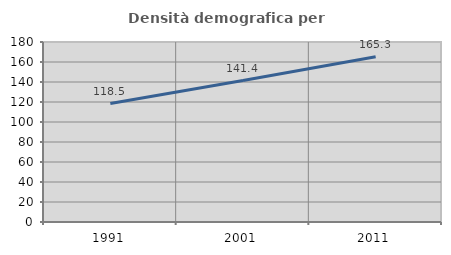
| Category | Densità demografica |
|---|---|
| 1991.0 | 118.462 |
| 2001.0 | 141.449 |
| 2011.0 | 165.291 |